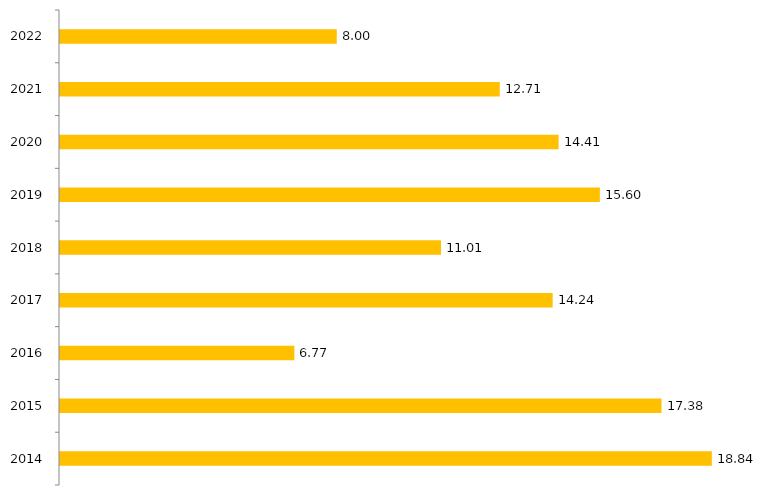
| Category | Series 1 |
|---|---|
| 2014.0 | 18.84 |
| 2015.0 | 17.385 |
| 2016.0 | 6.773 |
| 2017.0 | 14.238 |
| 2018.0 | 11.012 |
| 2019.0 | 15.603 |
| 2020.0 | 14.41 |
| 2021.0 | 12.71 |
| 2022.0 | 8 |